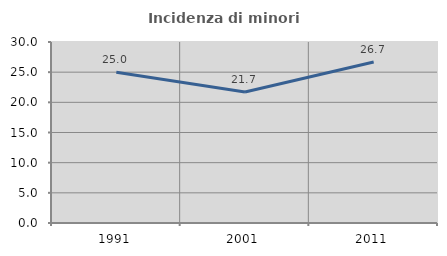
| Category | Incidenza di minori stranieri |
|---|---|
| 1991.0 | 25 |
| 2001.0 | 21.705 |
| 2011.0 | 26.679 |